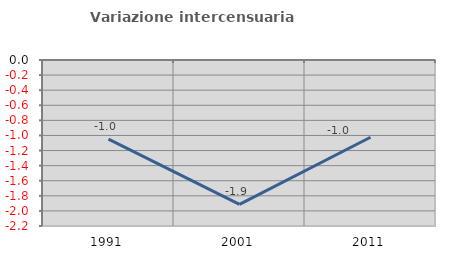
| Category | Variazione intercensuaria annua |
|---|---|
| 1991.0 | -1.048 |
| 2001.0 | -1.913 |
| 2011.0 | -1.024 |